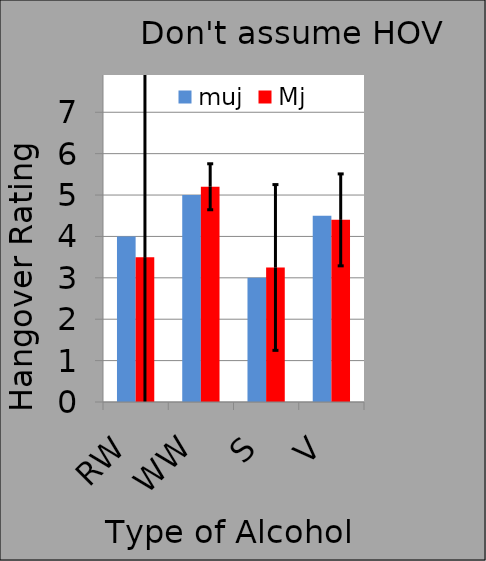
| Category | muj | Mj |
|---|---|---|
| RW | 4 | 3.5 |
| WW | 5 | 5.2 |
| S | 3 | 3.25 |
| V | 4.5 | 4.4 |